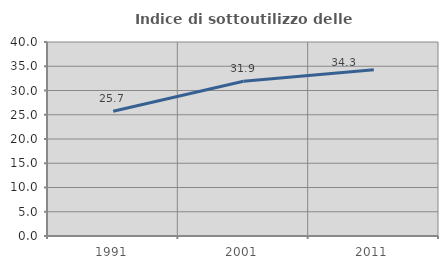
| Category | Indice di sottoutilizzo delle abitazioni  |
|---|---|
| 1991.0 | 25.723 |
| 2001.0 | 31.915 |
| 2011.0 | 34.27 |